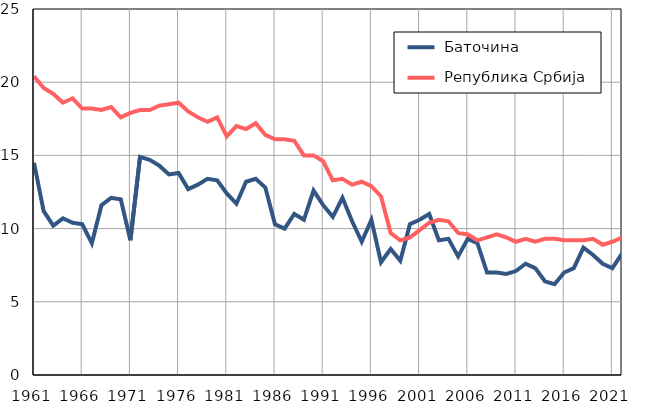
| Category |  Баточина |  Република Србија |
|---|---|---|
| 1961.0 | 14.5 | 20.4 |
| 1962.0 | 11.2 | 19.6 |
| 1963.0 | 10.2 | 19.2 |
| 1964.0 | 10.7 | 18.6 |
| 1965.0 | 10.4 | 18.9 |
| 1966.0 | 10.3 | 18.2 |
| 1967.0 | 9 | 18.2 |
| 1968.0 | 11.6 | 18.1 |
| 1969.0 | 12.1 | 18.3 |
| 1970.0 | 12 | 17.6 |
| 1971.0 | 9.2 | 17.9 |
| 1972.0 | 14.9 | 18.1 |
| 1973.0 | 14.7 | 18.1 |
| 1974.0 | 14.3 | 18.4 |
| 1975.0 | 13.7 | 18.5 |
| 1976.0 | 13.8 | 18.6 |
| 1977.0 | 12.7 | 18 |
| 1978.0 | 13 | 17.6 |
| 1979.0 | 13.4 | 17.3 |
| 1980.0 | 13.3 | 17.6 |
| 1981.0 | 12.4 | 16.3 |
| 1982.0 | 11.7 | 17 |
| 1983.0 | 13.2 | 16.8 |
| 1984.0 | 13.4 | 17.2 |
| 1985.0 | 12.8 | 16.4 |
| 1986.0 | 10.3 | 16.1 |
| 1987.0 | 10 | 16.1 |
| 1988.0 | 11 | 16 |
| 1989.0 | 10.6 | 15 |
| 1990.0 | 12.6 | 15 |
| 1991.0 | 11.6 | 14.6 |
| 1992.0 | 10.8 | 13.3 |
| 1993.0 | 12.1 | 13.4 |
| 1994.0 | 10.5 | 13 |
| 1995.0 | 9.1 | 13.2 |
| 1996.0 | 10.6 | 12.9 |
| 1997.0 | 7.7 | 12.2 |
| 1998.0 | 8.6 | 9.7 |
| 1999.0 | 7.8 | 9.2 |
| 2000.0 | 10.3 | 9.4 |
| 2001.0 | 10.6 | 9.9 |
| 2002.0 | 11 | 10.4 |
| 2003.0 | 9.2 | 10.6 |
| 2004.0 | 9.3 | 10.5 |
| 2005.0 | 8.1 | 9.7 |
| 2006.0 | 9.3 | 9.6 |
| 2007.0 | 9 | 9.2 |
| 2008.0 | 7 | 9.4 |
| 2009.0 | 7 | 9.6 |
| 2010.0 | 6.9 | 9.4 |
| 2011.0 | 7.1 | 9.1 |
| 2012.0 | 7.6 | 9.3 |
| 2013.0 | 7.3 | 9.1 |
| 2014.0 | 6.4 | 9.3 |
| 2015.0 | 6.2 | 9.3 |
| 2016.0 | 7 | 9.2 |
| 2017.0 | 7.3 | 9.2 |
| 2018.0 | 8.7 | 9.2 |
| 2019.0 | 8.2 | 9.3 |
| 2020.0 | 7.6 | 8.9 |
| 2021.0 | 7.3 | 9.1 |
| 2022.0 | 8.3 | 9.4 |